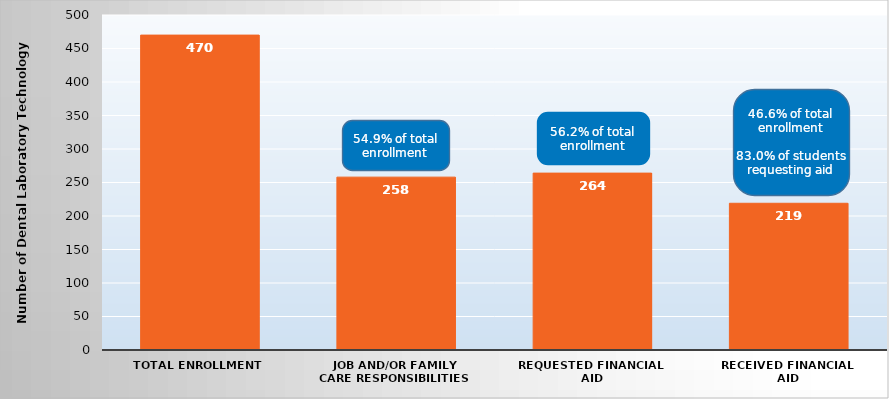
| Category | Series 0 |
|---|---|
| Total Enrollment | 470 |
| Job and/or Family Care Responsibilities | 258 |
| Requested Financial Aid | 264 |
| Received Financial Aid | 219 |